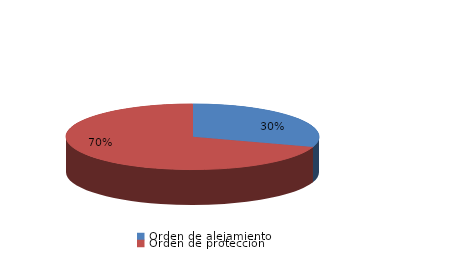
| Category | Series 0 |
|---|---|
| Orden de alejamiento | 12 |
| Orden de protección | 28 |